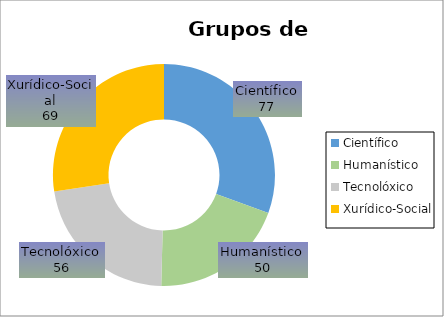
| Category | Series 0 |
|---|---|
| Científico | 77 |
| Humanístico | 50 |
| Tecnolóxico | 56 |
| Xurídico-Social | 69 |